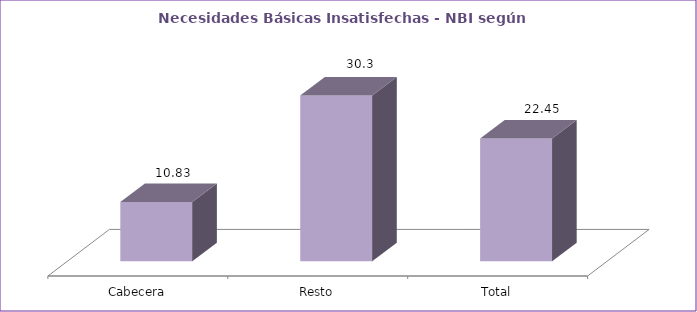
| Category | Series 0 |
|---|---|
| Cabecera | 10.83 |
| Resto | 30.3 |
| Total | 22.45 |